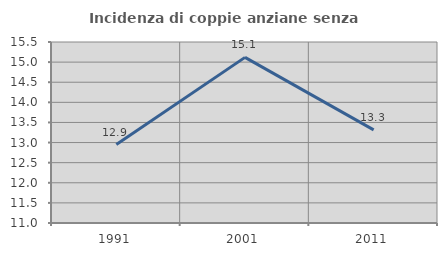
| Category | Incidenza di coppie anziane senza figli  |
|---|---|
| 1991.0 | 12.95 |
| 2001.0 | 15.118 |
| 2011.0 | 13.316 |